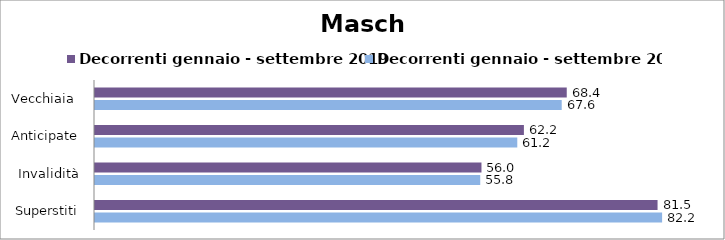
| Category | Decorrenti gennaio - settembre 2019 | Decorrenti gennaio - settembre 2020 |
|---|---|---|
| Vecchiaia  | 68.37 | 67.64 |
| Anticipate | 62.16 | 61.2 |
| Invalidità | 56.01 | 55.83 |
| Superstiti | 81.53 | 82.19 |